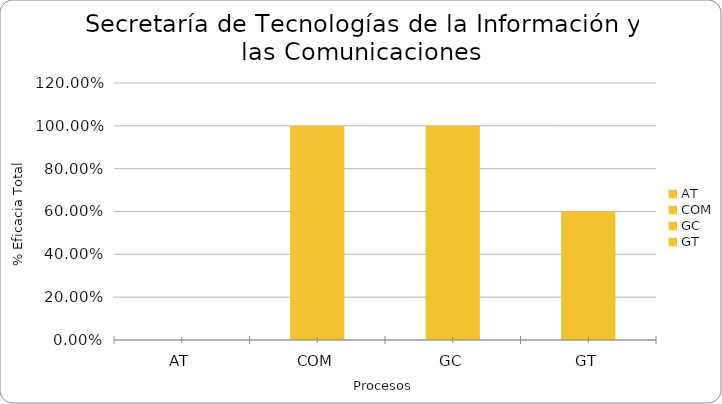
| Category | % Eficacia total |
|---|---|
| AT | 0 |
| COM | 1 |
| GC | 1 |
| GT | 0.6 |